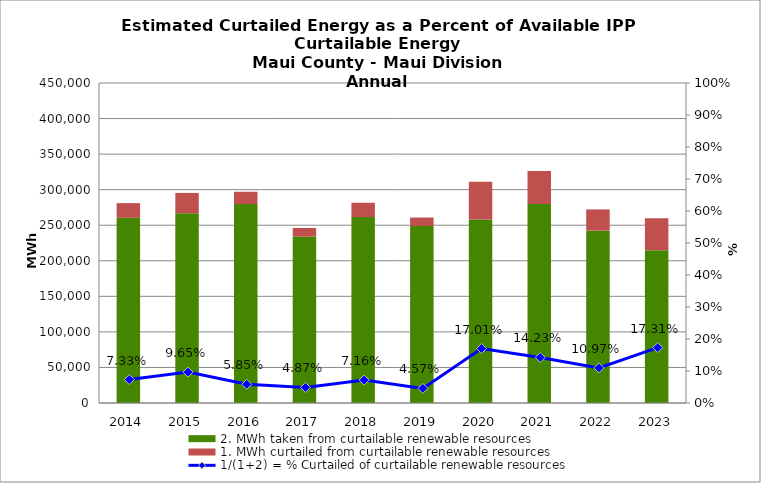
| Category | 2. MWh taken from curtailable renewable resources | 1. MWh curtailed from curtailable renewable resources |
|---|---|---|
| 2014.0 | 260448.469 | 20600.31 |
| 2015.0 | 266868 | 28509.88 |
| 2016.0 | 279696.793 | 17371.418 |
| 2017.0 | 234075.023 | 11988.113 |
| 2018.0 | 261421.805 | 20165.043 |
| 2019.0 | 248899.516 | 11913.966 |
| 2020.0 | 258207.35 | 52927.263 |
| 2021.0 | 279812.267 | 46435.449 |
| 2022.0 | 242334.495 | 29857.494 |
| 2023.0 | 214835.73 | 44967.379 |